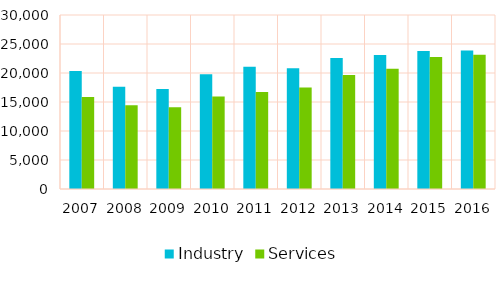
| Category | Industry | Services |
|---|---|---|
| 2007.0 | 20337 | 15859 |
| 2008.0 | 17647 | 14433 |
| 2009.0 | 17231 | 14096 |
| 2010.0 | 19787 | 15951 |
| 2011.0 | 21058 | 16728 |
| 2012.0 | 20806 | 17493 |
| 2013.0 | 22604 | 19660 |
| 2014.0 | 23089 | 20741 |
| 2015.0 | 23800 | 22767 |
| 2016.0 | 23859 | 23138 |